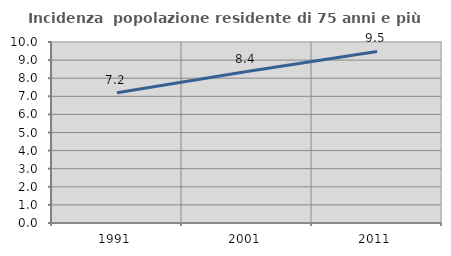
| Category | Incidenza  popolazione residente di 75 anni e più |
|---|---|
| 1991.0 | 7.193 |
| 2001.0 | 8.366 |
| 2011.0 | 9.479 |